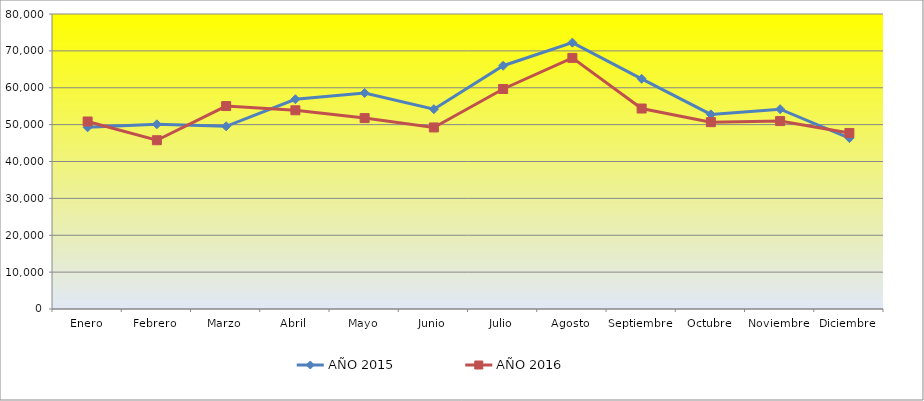
| Category | AÑO 2015 | AÑO 2016 |
|---|---|---|
| Enero | 49267 | 50850 |
| Febrero | 50092 | 45768 |
| Marzo | 49540 | 55037 |
| Abril | 56878 | 53889 |
| Mayo | 58578 | 51773 |
| Junio | 54193 | 49237 |
| Julio | 65969 | 59662 |
| Agosto | 72235 | 68100 |
| Septiembre | 62421 | 54368 |
| Octubre | 52773 | 50667 |
| Noviembre | 54191 | 50957 |
| Diciembre | 46362 | 47739 |